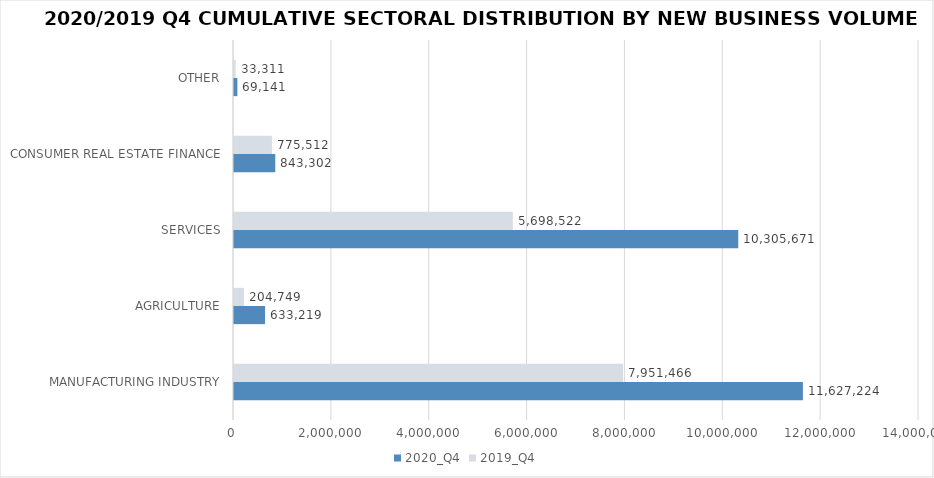
| Category | 2020_Q4 | 2019_Q4 |
|---|---|---|
| MANUFACTURING INDUSTRY | 11627224.274 | 7951466.455 |
| AGRICULTURE | 633218.575 | 204749.488 |
| SERVICES | 10305671.197 | 5698522.208 |
| CONSUMER REAL ESTATE FINANCE | 843302 | 775512 |
| OTHER | 69141.38 | 33311.15 |